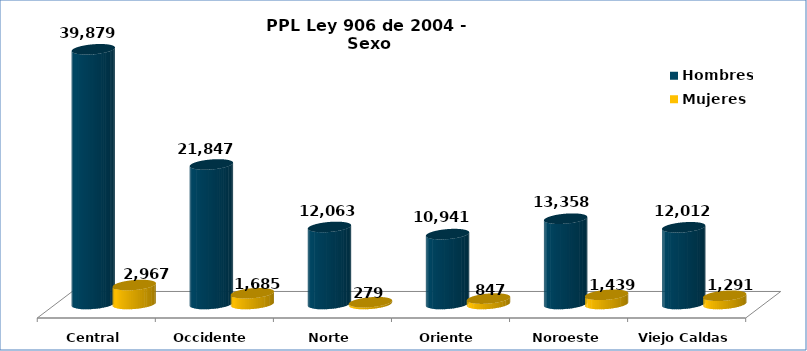
| Category | Hombres | Mujeres |
|---|---|---|
| Central | 39879 | 2967 |
| Occidente | 21847 | 1685 |
| Norte | 12063 | 279 |
| Oriente | 10941 | 847 |
| Noroeste | 13358 | 1439 |
| Viejo Caldas | 12012 | 1291 |